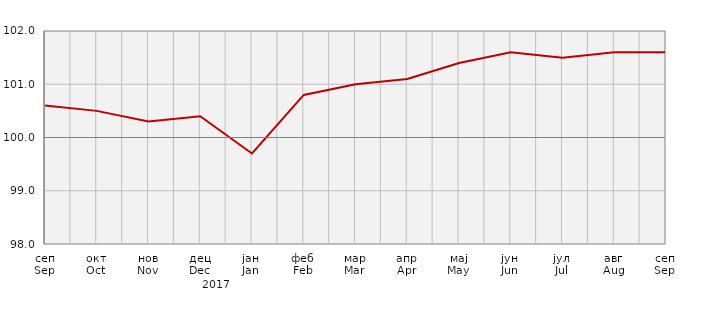
| Category | Индекси потрошачких цијена
Consumer price indices |
|---|---|
| сеп
Sep | 100.6 |
| окт
Oct | 100.5 |
| нов
Nov | 100.3 |
| дец
Dec | 100.4 |
| јан
Jan | 99.7 |
| феб
Feb | 100.8 |
| мар
Mar | 101 |
| апр
Apr | 101.1 |
| мај
May | 101.4 |
| јун
Jun | 101.6 |
| јул
Jul | 101.5 |
| авг
Aug | 101.6 |
| сеп
Sep | 101.6 |